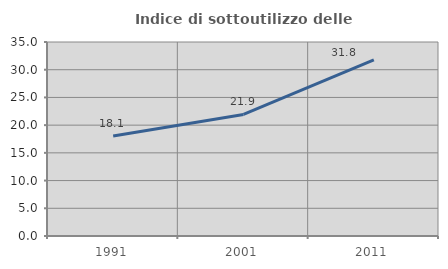
| Category | Indice di sottoutilizzo delle abitazioni  |
|---|---|
| 1991.0 | 18.058 |
| 2001.0 | 21.93 |
| 2011.0 | 31.768 |